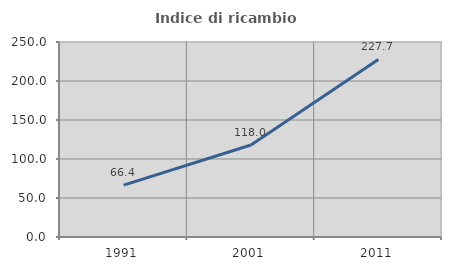
| Category | Indice di ricambio occupazionale  |
|---|---|
| 1991.0 | 66.438 |
| 2001.0 | 118 |
| 2011.0 | 227.66 |